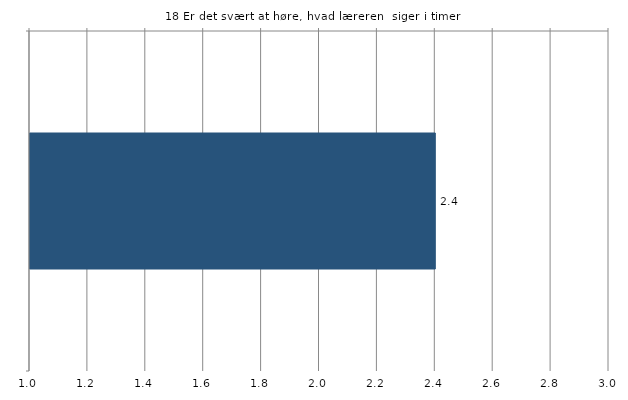
| Category | Gns. |
|---|---|
|    | 2.4 |